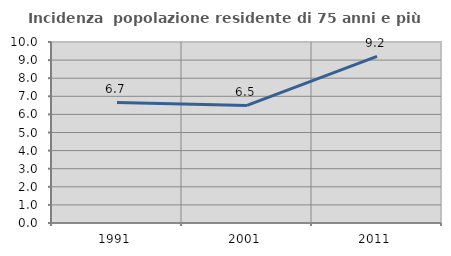
| Category | Incidenza  popolazione residente di 75 anni e più |
|---|---|
| 1991.0 | 6.663 |
| 2001.0 | 6.498 |
| 2011.0 | 9.201 |